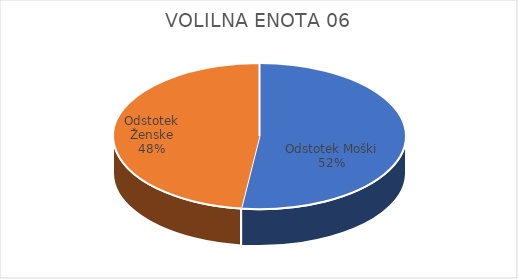
| Category | VOLILNA ENOTA 06 | #REF! | Slovenija skupaj |
|---|---|---|---|
| Odstotek Moški | 7.42 |  | 7.6 |
| Odstotek Ženske | 6.85 |  | 7.35 |